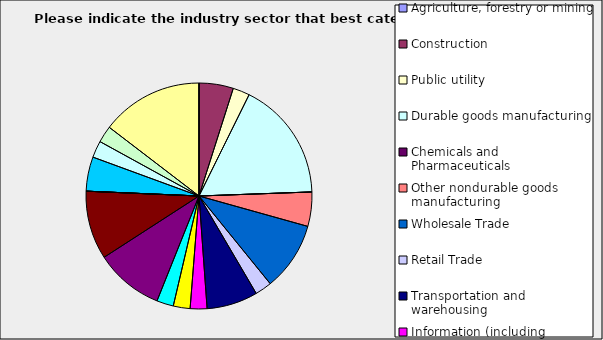
| Category | Series 0 |
|---|---|
| Agriculture, forestry or mining | 0 |
| Construction | 0.049 |
| Public utility | 0.024 |
| Durable goods manufacturing | 0.171 |
| Chemicals and Pharmaceuticals | 0 |
| Other nondurable goods manufacturing | 0.049 |
| Wholesale Trade | 0.098 |
| Retail Trade | 0.024 |
| Transportation and warehousing | 0.073 |
| Information (including broadcasting and telecommunication) | 0.024 |
| Finance and Insurance | 0.024 |
| Real Estate | 0.024 |
| Professional, scientific and technical services | 0.098 |
| Consulting | 0.098 |
| Administrative and office services (including waste management) | 0 |
| Education | 0 |
| Health Care and social services | 0.049 |
| Arts, entertainment and recreation | 0.024 |
| Accommodation and food services | 0.024 |
| Other | 0.146 |